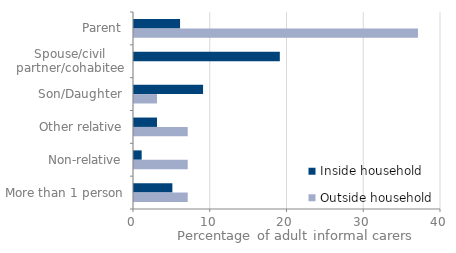
| Category | Inside household | Outside household |
|---|---|---|
| Parent | 6 | 37 |
| Spouse/civil partner/cohabitee | 19 | 0 |
| Son/Daughter | 9 | 3 |
| Other relative | 3 | 7 |
| Non-relative | 1 | 7 |
| More than 1 person | 5 | 7 |